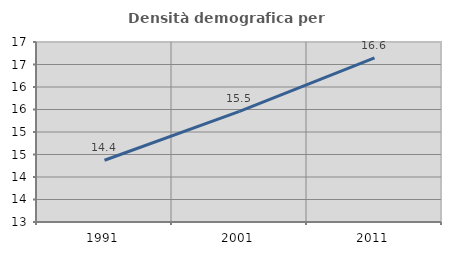
| Category | Densità demografica |
|---|---|
| 1991.0 | 14.372 |
| 2001.0 | 15.456 |
| 2011.0 | 16.65 |